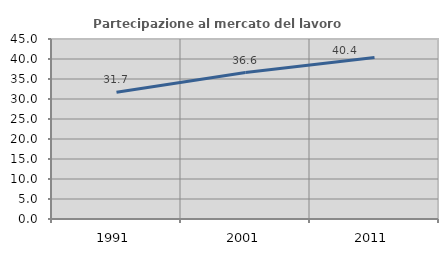
| Category | Partecipazione al mercato del lavoro  femminile |
|---|---|
| 1991.0 | 31.677 |
| 2001.0 | 36.616 |
| 2011.0 | 40.4 |